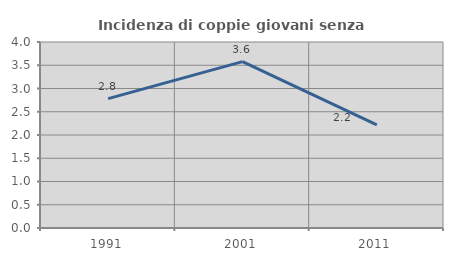
| Category | Incidenza di coppie giovani senza figli |
|---|---|
| 1991.0 | 2.782 |
| 2001.0 | 3.578 |
| 2011.0 | 2.218 |